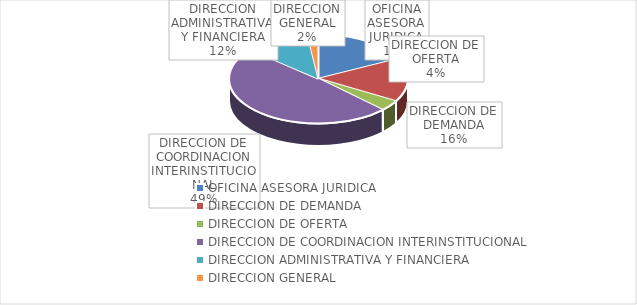
| Category | Series 0 |
|---|---|
| OFICINA ASESORA JURIDICA | 9 |
| DIRECCION DE DEMANDA | 8 |
| DIRECCION DE OFERTA | 2 |
| DIRECCION DE COORDINACION INTERINSTITUCIONAL | 25 |
| DIRECCION ADMINISTRATIVA Y FINANCIERA | 6 |
| DIRECCION GENERAL | 1 |